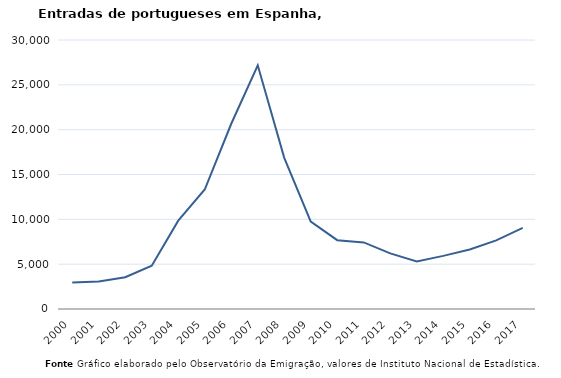
| Category | Entradas |
|---|---|
| 2000.0 | 2968 |
| 2001.0 | 3057 |
| 2002.0 | 3538 |
| 2003.0 | 4825 |
| 2004.0 | 9851 |
| 2005.0 | 13327 |
| 2006.0 | 20658 |
| 2007.0 | 27178 |
| 2008.0 | 16857 |
| 2009.0 | 9739 |
| 2010.0 | 7678 |
| 2011.0 | 7424 |
| 2012.0 | 6201 |
| 2013.0 | 5302 |
| 2014.0 | 5923 |
| 2015.0 | 6638 |
| 2016.0 | 7646 |
| 2017.0 | 9038 |